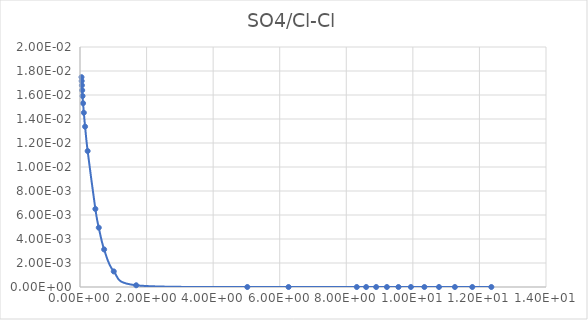
| Category | SO4/Cl |
|---|---|
| 0.045799 | 0.017 |
| 0.050887 | 0.017 |
| 0.057261 | 0.017 |
| 0.065458 | 0.016 |
| 0.076373 | 0.016 |
| 0.091688 | 0.015 |
| 0.11464 | 0.015 |
| 0.15299 | 0.013 |
| 0.22973 | 0.011 |
| 0.46172 | 0.007 |
| 0.56419 | 0.005 |
| 0.72511 | 0.003 |
| 1.0144 | 0.001 |
| 1.688 | 0 |
| 5.0263 | 0 |
| 6.2654 | 0 |
| 8.3152 | 0 |
| 8.5965 | 0 |
| 8.8974 | 0 |
| 9.2202 | 0 |
| 9.5673 | 0 |
| 9.9415 | 0 |
| 10.346 | 0 |
| 10.785 | 0 |
| 11.263 | 0 |
| 11.785 | 0 |
| 12.358 | 0 |